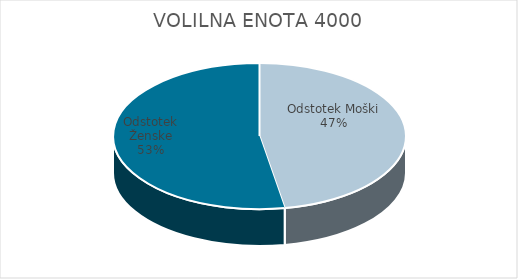
| Category | VOLILNA ENOTA 4000 | #REF! | Slovenija skupaj |
|---|---|---|---|
| Odstotek Moški | 19.87 |  | 19.85 |
| Odstotek Ženske | 22.18 |  | 21.47 |